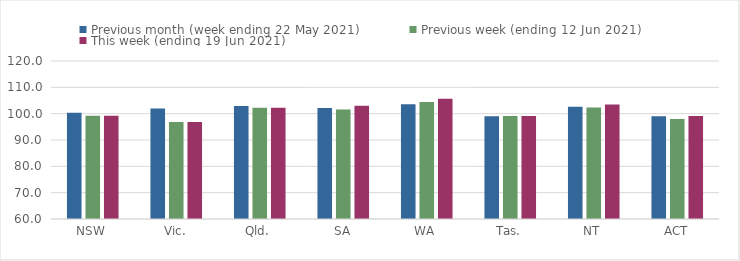
| Category | Previous month (week ending 22 May 2021) | Previous week (ending 12 Jun 2021) | This week (ending 19 Jun 2021) |
|---|---|---|---|
| NSW | 100.36 | 99.21 | 99.21 |
| Vic. | 101.92 | 96.88 | 96.88 |
| Qld. | 102.92 | 102.2 | 102.2 |
| SA | 102.18 | 101.61 | 103.05 |
| WA | 103.59 | 104.47 | 105.63 |
| Tas. | 98.99 | 99.16 | 99.16 |
| NT | 102.67 | 102.31 | 103.49 |
| ACT | 99.02 | 97.96 | 99.15 |